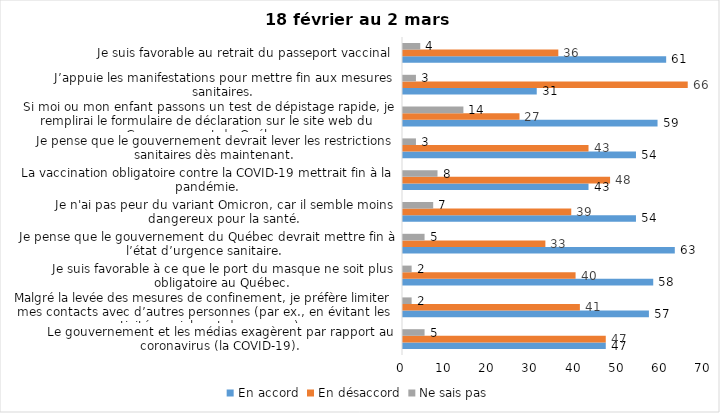
| Category | En accord | En désaccord | Ne sais pas |
|---|---|---|---|
| Le gouvernement et les médias exagèrent par rapport au coronavirus (la COVID-19). | 47 | 47 | 5 |
| Malgré la levée des mesures de confinement, je préfère limiter mes contacts avec d’autres personnes (par ex., en évitant les activités sociales et de groupes) | 57 | 41 | 2 |
| Je suis favorable à ce que le port du masque ne soit plus obligatoire au Québec. | 58 | 40 | 2 |
| Je pense que le gouvernement du Québec devrait mettre fin à l’état d’urgence sanitaire.  | 63 | 33 | 5 |
| Je n'ai pas peur du variant Omicron, car il semble moins dangereux pour la santé. | 54 | 39 | 7 |
| La vaccination obligatoire contre la COVID-19 mettrait fin à la pandémie. | 43 | 48 | 8 |
| Je pense que le gouvernement devrait lever les restrictions sanitaires dès maintenant. | 54 | 43 | 3 |
| Si moi ou mon enfant passons un test de dépistage rapide, je remplirai le formulaire de déclaration sur le site web du Gouvernement du Québec. | 59 | 27 | 14 |
| J’appuie les manifestations pour mettre fin aux mesures sanitaires. | 31 | 66 | 3 |
| Je suis favorable au retrait du passeport vaccinal | 61 | 36 | 4 |